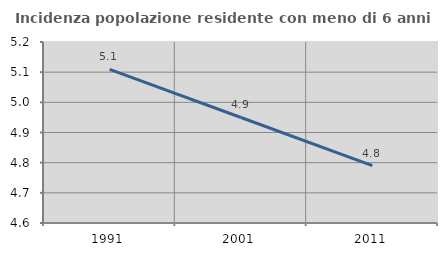
| Category | Incidenza popolazione residente con meno di 6 anni |
|---|---|
| 1991.0 | 5.109 |
| 2001.0 | 4.95 |
| 2011.0 | 4.79 |